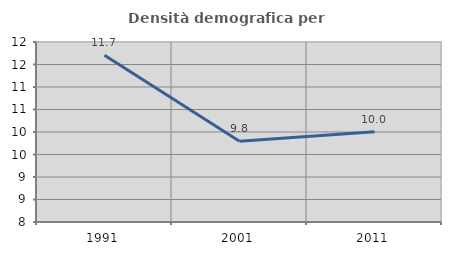
| Category | Densità demografica |
|---|---|
| 1991.0 | 11.706 |
| 2001.0 | 9.795 |
| 2011.0 | 10.004 |